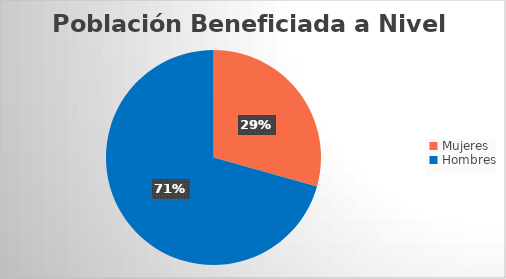
| Category | Series 0 |
|---|---|
| Mujeres | 54 |
| Hombres | 130 |